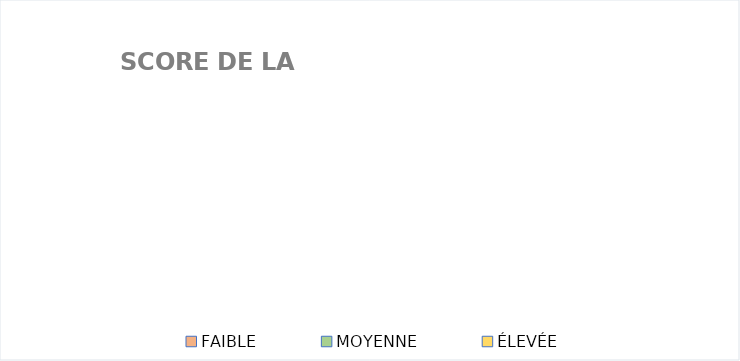
| Category | Series 0 |
|---|---|
| FAIBLE | 0 |
| MOYENNE | 0 |
| ÉLEVÉE | 0 |